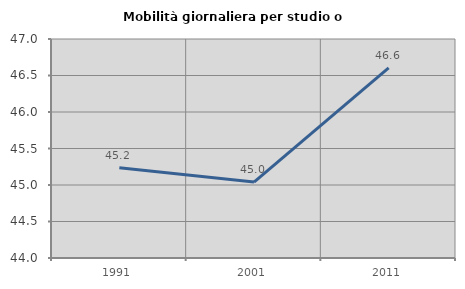
| Category | Mobilità giornaliera per studio o lavoro |
|---|---|
| 1991.0 | 45.236 |
| 2001.0 | 45.04 |
| 2011.0 | 46.605 |